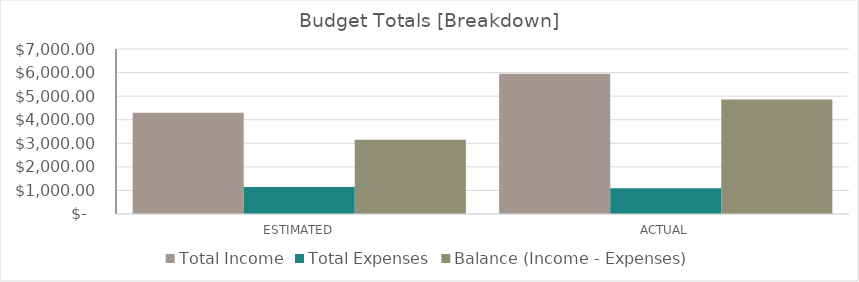
| Category | Total Income | Total Expenses | Balance (Income - Expenses) |
|---|---|---|---|
| ESTIMATED | 4300 | 1150 | 3150 |
| ACTUAL | 5950 | 1090 | 4860 |